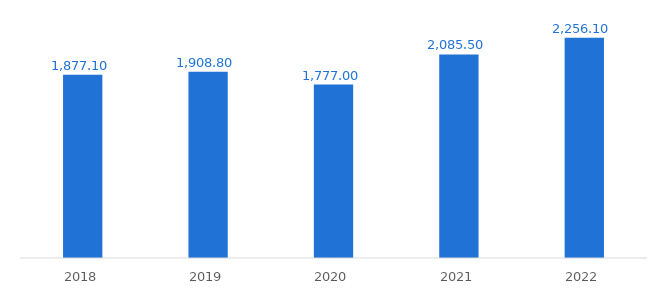
| Category | Arrecadação federal |
|---|---|
| 2022.0 | 2256.1 |
| 2021.0 | 2085.5 |
| 2020.0 | 1777 |
| 2019.0 | 1908.8 |
| 2018.0 | 1877.1 |